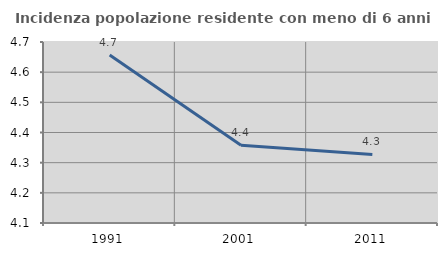
| Category | Incidenza popolazione residente con meno di 6 anni |
|---|---|
| 1991.0 | 4.657 |
| 2001.0 | 4.358 |
| 2011.0 | 4.327 |